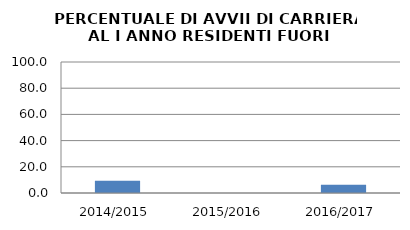
| Category | 2014/2015 2015/2016 2016/2017 |
|---|---|
| 2014/2015 | 9.302 |
| 2015/2016 | 0 |
| 2016/2017 | 6.25 |